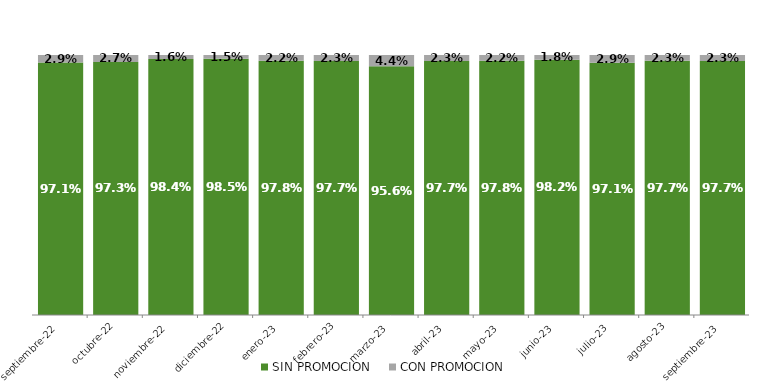
| Category | SIN PROMOCION   | CON PROMOCION   |
|---|---|---|
| 2022-09-01 | 0.971 | 0.029 |
| 2022-10-01 | 0.973 | 0.027 |
| 2022-11-01 | 0.984 | 0.016 |
| 2022-12-01 | 0.985 | 0.015 |
| 2023-01-01 | 0.978 | 0.022 |
| 2023-02-01 | 0.977 | 0.023 |
| 2023-03-01 | 0.956 | 0.044 |
| 2023-04-01 | 0.977 | 0.023 |
| 2023-05-01 | 0.978 | 0.022 |
| 2023-06-01 | 0.982 | 0.018 |
| 2023-07-01 | 0.971 | 0.029 |
| 2023-08-01 | 0.977 | 0.023 |
| 2023-09-01 | 0.977 | 0.023 |